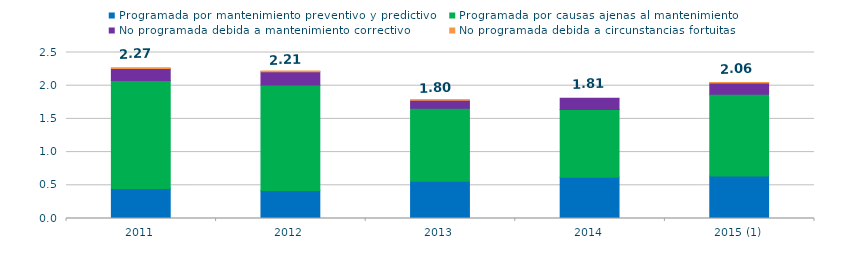
| Category | Programada por mantenimiento preventivo y predictivo | Programada por causas ajenas al mantenimiento  | No programada debida a mantenimiento correctivo  | No programada debida a circunstancias fortuitas  |
|---|---|---|---|---|
| 2011 | 0.45 | 1.63 | 0.18 | 0.01 |
| 2012 | 0.42 | 1.59 | 0.2 | 0.01 |
| 2013 | 0.56 | 1.1 | 0.12 | 0.01 |
| 2014 | 0.62 | 1.02 | 0.17 | 0 |
| 2015 (1) | 0.64 | 1.23 | 0.17 | 0.01 |